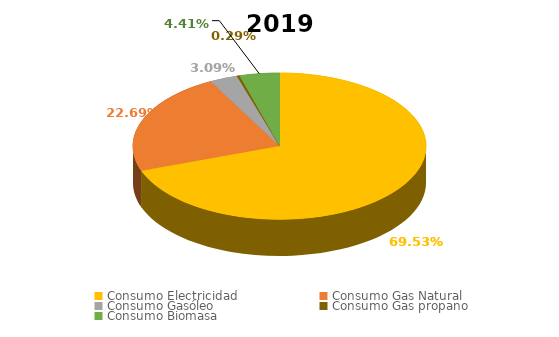
| Category | 2019 |
|---|---|
| Consumo Electricidad | 26359.254 |
| Consumo Gas Natural | 8600.568 |
| Consumo Gasóleo | 1170.121 |
| Consumo Gas propano | 109.595 |
| Consumo Biomasa | 1671.752 |